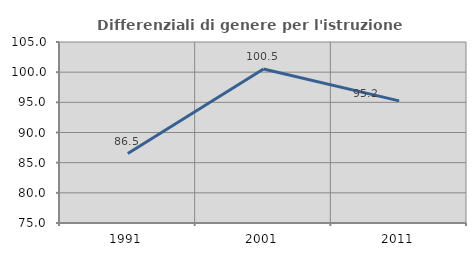
| Category | Differenziali di genere per l'istruzione superiore |
|---|---|
| 1991.0 | 86.516 |
| 2001.0 | 100.525 |
| 2011.0 | 95.247 |